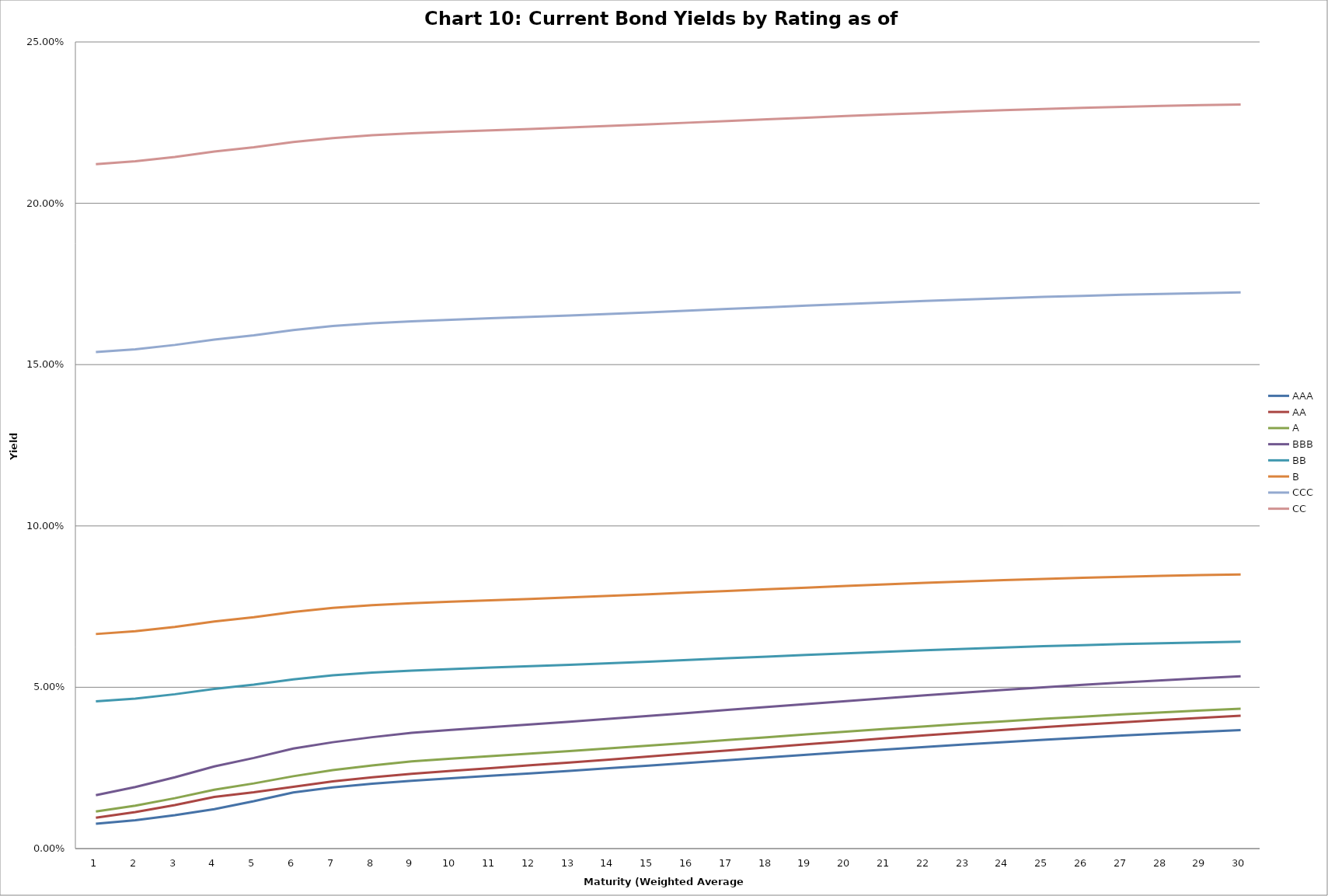
| Category | AAA | AA | A | BBB | BB | B | CCC | CC |
|---|---|---|---|---|---|---|---|---|
| 0 | 0.008 | 0.01 | 0.011 | 0.017 | 0.046 | 0.067 | 0.154 | 0.212 |
| 1 | 0.009 | 0.011 | 0.013 | 0.019 | 0.047 | 0.067 | 0.155 | 0.213 |
| 2 | 0.01 | 0.013 | 0.016 | 0.022 | 0.048 | 0.069 | 0.156 | 0.214 |
| 3 | 0.012 | 0.016 | 0.018 | 0.025 | 0.05 | 0.07 | 0.158 | 0.216 |
| 4 | 0.015 | 0.017 | 0.02 | 0.028 | 0.051 | 0.072 | 0.159 | 0.217 |
| 5 | 0.017 | 0.019 | 0.022 | 0.031 | 0.052 | 0.073 | 0.161 | 0.219 |
| 6 | 0.019 | 0.021 | 0.024 | 0.033 | 0.054 | 0.075 | 0.162 | 0.22 |
| 7 | 0.02 | 0.022 | 0.026 | 0.035 | 0.055 | 0.075 | 0.163 | 0.221 |
| 8 | 0.021 | 0.023 | 0.027 | 0.036 | 0.055 | 0.076 | 0.163 | 0.222 |
| 9 | 0.022 | 0.024 | 0.028 | 0.037 | 0.056 | 0.077 | 0.164 | 0.222 |
| 10 | 0.023 | 0.025 | 0.029 | 0.038 | 0.056 | 0.077 | 0.164 | 0.223 |
| 11 | 0.023 | 0.026 | 0.029 | 0.038 | 0.057 | 0.077 | 0.165 | 0.223 |
| 12 | 0.024 | 0.027 | 0.03 | 0.039 | 0.057 | 0.078 | 0.165 | 0.223 |
| 13 | 0.025 | 0.028 | 0.031 | 0.04 | 0.057 | 0.078 | 0.166 | 0.224 |
| 14 | 0.026 | 0.029 | 0.032 | 0.041 | 0.058 | 0.079 | 0.166 | 0.224 |
| 15 | 0.027 | 0.029 | 0.033 | 0.042 | 0.058 | 0.079 | 0.167 | 0.225 |
| 16 | 0.027 | 0.03 | 0.034 | 0.043 | 0.059 | 0.08 | 0.167 | 0.226 |
| 17 | 0.028 | 0.031 | 0.035 | 0.044 | 0.059 | 0.08 | 0.168 | 0.226 |
| 18 | 0.029 | 0.032 | 0.035 | 0.045 | 0.06 | 0.081 | 0.168 | 0.227 |
| 19 | 0.03 | 0.033 | 0.036 | 0.046 | 0.061 | 0.081 | 0.169 | 0.227 |
| 20 | 0.031 | 0.034 | 0.037 | 0.047 | 0.061 | 0.082 | 0.169 | 0.228 |
| 21 | 0.032 | 0.035 | 0.038 | 0.048 | 0.061 | 0.082 | 0.17 | 0.228 |
| 22 | 0.032 | 0.036 | 0.039 | 0.048 | 0.062 | 0.083 | 0.17 | 0.228 |
| 23 | 0.033 | 0.037 | 0.039 | 0.049 | 0.062 | 0.083 | 0.171 | 0.229 |
| 24 | 0.034 | 0.038 | 0.04 | 0.05 | 0.063 | 0.084 | 0.171 | 0.229 |
| 25 | 0.034 | 0.038 | 0.041 | 0.051 | 0.063 | 0.084 | 0.171 | 0.23 |
| 26 | 0.035 | 0.039 | 0.042 | 0.051 | 0.063 | 0.084 | 0.172 | 0.23 |
| 27 | 0.036 | 0.04 | 0.042 | 0.052 | 0.064 | 0.085 | 0.172 | 0.23 |
| 28 | 0.036 | 0.041 | 0.043 | 0.053 | 0.064 | 0.085 | 0.172 | 0.23 |
| 29 | 0.037 | 0.041 | 0.043 | 0.053 | 0.064 | 0.085 | 0.172 | 0.231 |